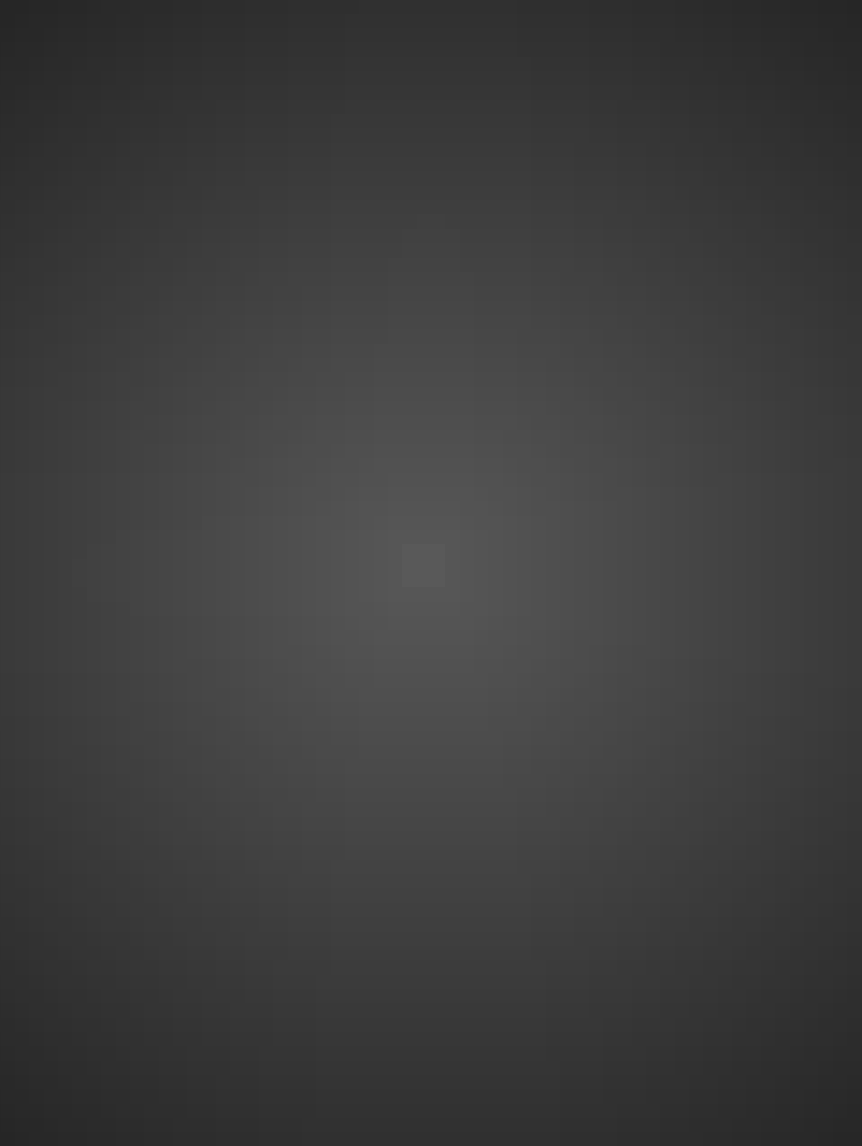
| Category | Total |
|---|---|
| 30.01 - Óleos e Lubrificantes | 246578.23 |
| 30.06 - Alimentos para animais | 1126744.81 |
| 30.08 - Animais para pesquisa e abate | 243347 |
| 30.16D - Carimbos | 5148.86 |
| 30.20 - Cama e mesa | 8446.96 |
| 30.24 - Material de Construção | 538443.58 |
| 30.24A - Material hidráulico | 29161.21 |
| 30.26 - Material Elétrico | 556682.99 |
| 30.42 - Ferramentas | 138639.04 |
| 39.41 - Coffee break | 78963.97 |
| 52.08 - Aparelhos de laboratório | 243591.55 |
| 52.39 - Equipamentos elétricos e hidráulicos | 42240.06 |
| 30.09 - Material farmacológico | 262017.3 |
| 30.11B - Material químico para piscina | 111496.64 |
| 52.04 - Aparelhos de medição | 9192.2 |
| 52.99 - Ferramentas permanentes | 839.28 |
| 30.07 - Gêneros alimentícios estocáveis | 801168.06 |
|  30.31 – Sementes, mudas de plantas e insumos | 153536.69 |